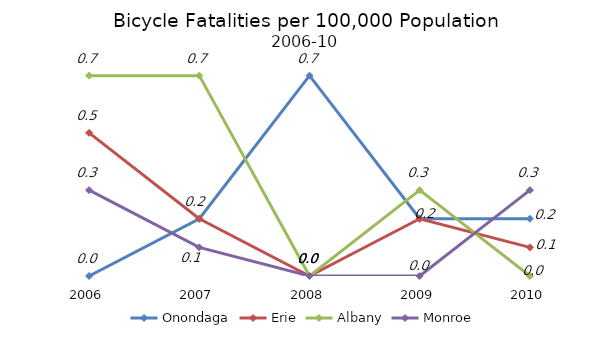
| Category | Onondaga | Erie | Albany | Monroe |
|---|---|---|---|---|
| 2006.0 | 0 | 0.5 | 0.7 | 0.3 |
| 2007.0 | 0.2 | 0.2 | 0.7 | 0.1 |
| 2008.0 | 0.7 | 0 | 0 | 0 |
| 2009.0 | 0.2 | 0.2 | 0.3 | 0 |
| 2010.0 | 0.2 | 0.1 | 0 | 0.3 |